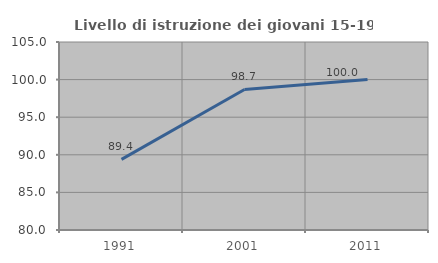
| Category | Livello di istruzione dei giovani 15-19 anni |
|---|---|
| 1991.0 | 89.394 |
| 2001.0 | 98.684 |
| 2011.0 | 100 |